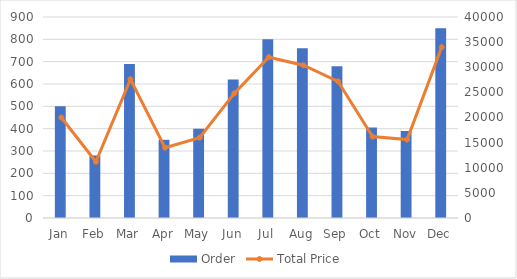
| Category | Order |
|---|---|
| Jan | 500 |
| Feb | 280 |
| Mar | 690 |
| Apr | 350 |
| May | 400 |
| Jun | 620 |
| Jul | 800 |
| Aug | 760 |
| Sep | 680 |
| Oct | 405 |
| Nov | 390 |
| Dec | 850 |